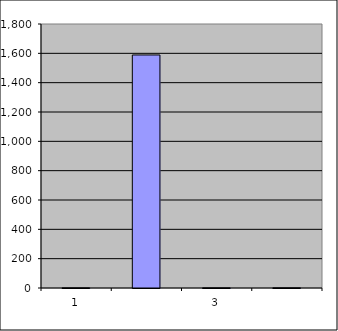
| Category | Series 0 |
|---|---|
| 0 | 1 |
| 1 | 1588.744 |
| 2 | 0.975 |
| 3 | 1.209 |